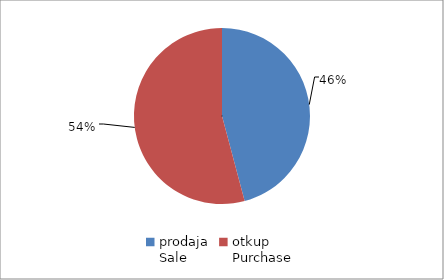
| Category | Series 0 |
|---|---|
| prodaja
Sale | 14975909 |
| otkup
Purchase | 17679509 |